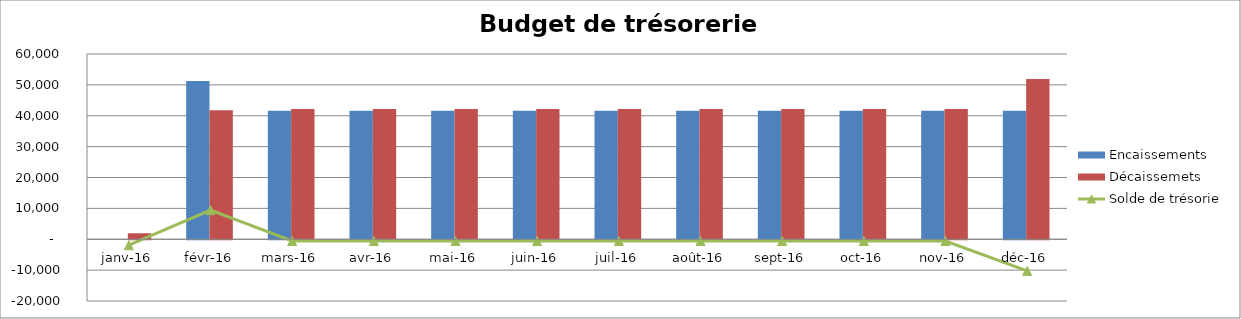
| Category | Encaissements | Décaissemets |
|---|---|---|
| janv-16 | 0 | 1934.917 |
| févr-16 | 51239.183 | 41805.85 |
| mars-16 | 41640 | 42206.667 |
| avr-16 | 41640 | 42206.667 |
| mai-16 | 41640 | 42206.667 |
| juin-16 | 41640 | 42206.667 |
| juil-16 | 41640 | 42206.667 |
| août-16 | 41640 | 42206.667 |
| sept-16 | 41640 | 42206.667 |
| oct-16 | 41640 | 42206.667 |
| nov-16 | 41640 | 42206.667 |
| déc-16 | 41640 | 51873.333 |